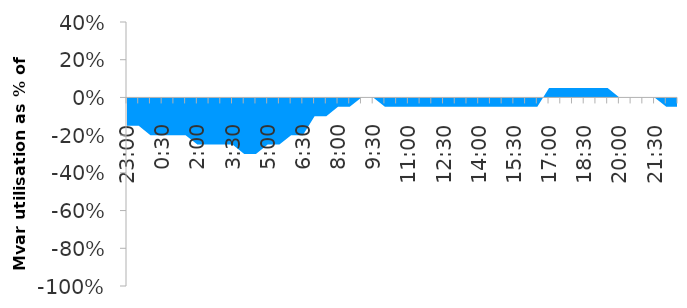
| Category | Series 1 |
|---|---|
| 0.9583333333333334 | -0.15 |
| 0.9791666666666666 | -0.15 |
| 0.0 | -0.2 |
| 0.020833333333333332 | -0.2 |
| 0.041666666666666664 | -0.2 |
| 0.0625 | -0.2 |
| 0.08333333333333333 | -0.25 |
| 0.10416666666666667 | -0.25 |
| 0.125 | -0.25 |
| 0.14583333333333334 | -0.25 |
| 0.16666666666666666 | -0.3 |
| 0.1875 | -0.3 |
| 0.20833333333333334 | -0.25 |
| 0.22916666666666666 | -0.25 |
| 0.25 | -0.2 |
| 0.2708333333333333 | -0.2 |
| 0.2916666666666667 | -0.1 |
| 0.3125 | -0.1 |
| 0.3333333333333333 | -0.05 |
| 0.3541666666666667 | -0.05 |
| 0.375 | 0 |
| 0.3958333333333333 | 0 |
| 0.4166666666666667 | -0.05 |
| 0.4375 | -0.05 |
| 0.4583333333333333 | -0.05 |
| 0.4791666666666667 | -0.05 |
| 0.5 | -0.05 |
| 0.5208333333333334 | -0.05 |
| 0.5416666666666666 | -0.05 |
| 0.5625 | -0.05 |
| 0.5833333333333334 | -0.05 |
| 0.6041666666666666 | -0.05 |
| 0.625 | -0.05 |
| 0.6458333333333334 | -0.05 |
| 0.6666666666666666 | -0.05 |
| 0.6875 | -0.05 |
| 0.7083333333333334 | 0.05 |
| 0.7291666666666666 | 0.05 |
| 0.75 | 0.05 |
| 0.7708333333333334 | 0.05 |
| 0.7916666666666666 | 0.05 |
| 0.8125 | 0.05 |
| 0.8333333333333334 | 0 |
| 0.8541666666666666 | 0 |
| 0.875 | 0 |
| 0.8958333333333334 | 0 |
| 0.9166666666666666 | -0.05 |
| 0.9375 | -0.05 |